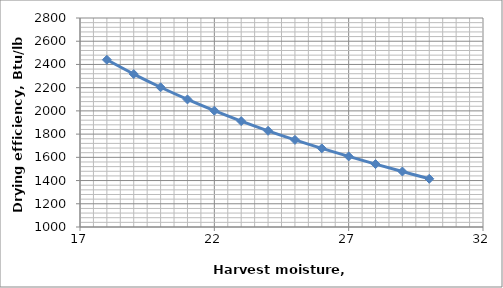
| Category | H20 |
|---|---|
| 18.0 | 2440.34 |
| 19.0 | 2317.097 |
| 20.0 | 2203.432 |
| 21.0 | 2098.536 |
| 22.0 | 2001.598 |
| 23.0 | 1911.808 |
| 24.0 | 1828.354 |
| 25.0 | 1750.428 |
| 26.0 | 1677.218 |
| 27.0 | 1607.914 |
| 28.0 | 1541.705 |
| 29.0 | 1477.782 |
| 30.0 | 1415.333 |